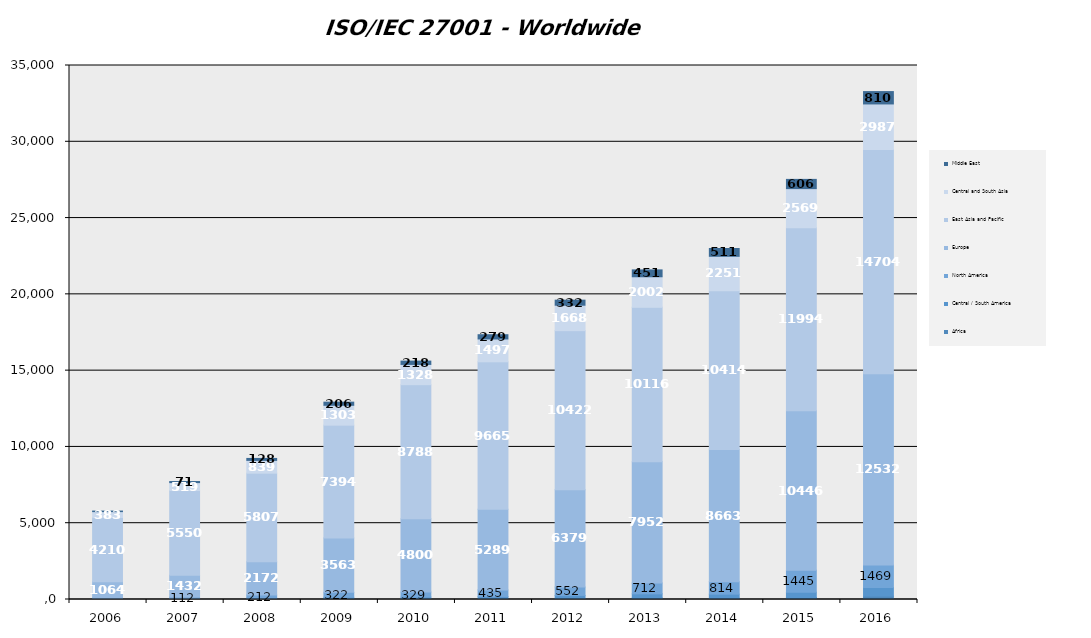
| Category | Africa | Central / South America       | North America | Europe | East Asia and Pacific | Central and South Asia | Middle East |
|---|---|---|---|---|---|---|---|
| 2006.0 | 6 | 18 | 79 | 1064 | 4210 | 383 | 37 |
| 2007.0 | 10 | 38 | 112 | 1432 | 5550 | 519 | 71 |
| 2008.0 | 16 | 72 | 212 | 2172 | 5807 | 839 | 128 |
| 2009.0 | 47 | 100 | 322 | 3563 | 7394 | 1303 | 206 |
| 2010.0 | 46 | 117 | 329 | 4800 | 8788 | 1328 | 218 |
| 2011.0 | 40 | 150 | 435 | 5289 | 9665 | 1497 | 279 |
| 2012.0 | 64 | 203 | 552 | 6379 | 10422 | 1668 | 332 |
| 2013.0 | 99 | 272 | 712 | 7952 | 10116 | 2002 | 451 |
| 2014.0 | 79 | 273 | 814 | 8663 | 10414 | 2251 | 511 |
| 2015.0 | 129 | 347 | 1445 | 10446 | 11994 | 2569 | 606 |
| 2016.0 | 224 | 564 | 1469 | 12532 | 14704 | 2987 | 810 |